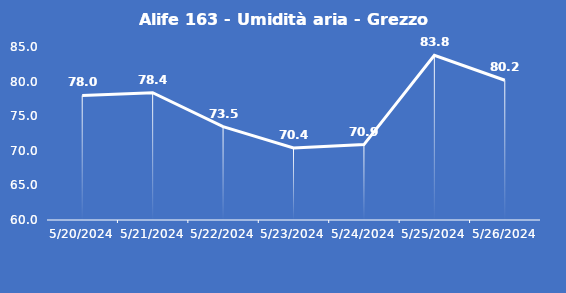
| Category | Alife 163 - Umidità aria - Grezzo (%) |
|---|---|
| 5/20/24 | 78 |
| 5/21/24 | 78.4 |
| 5/22/24 | 73.5 |
| 5/23/24 | 70.4 |
| 5/24/24 | 70.9 |
| 5/25/24 | 83.8 |
| 5/26/24 | 80.2 |